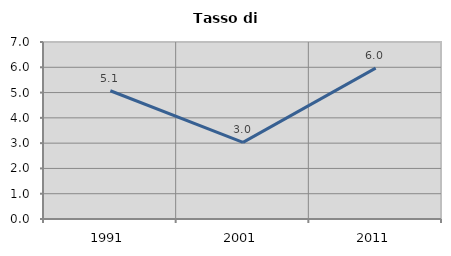
| Category | Tasso di disoccupazione   |
|---|---|
| 1991.0 | 5.072 |
| 2001.0 | 3.03 |
| 2011.0 | 5.967 |